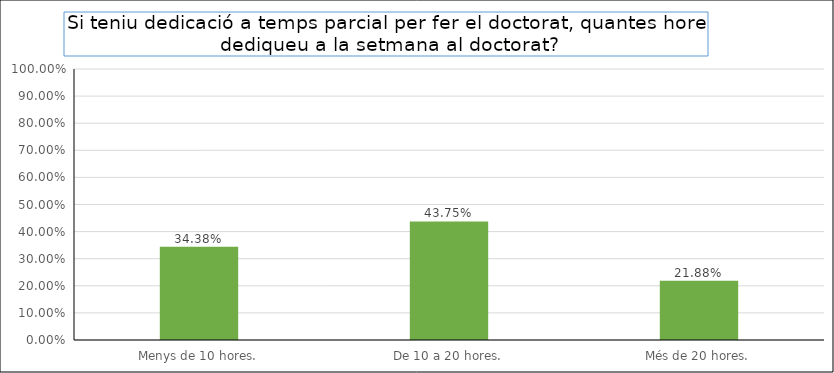
| Category | Series 0 |
|---|---|
| Menys de 10 hores. | 0.344 |
| De 10 a 20 hores. | 0.438 |
| Més de 20 hores. | 0.219 |